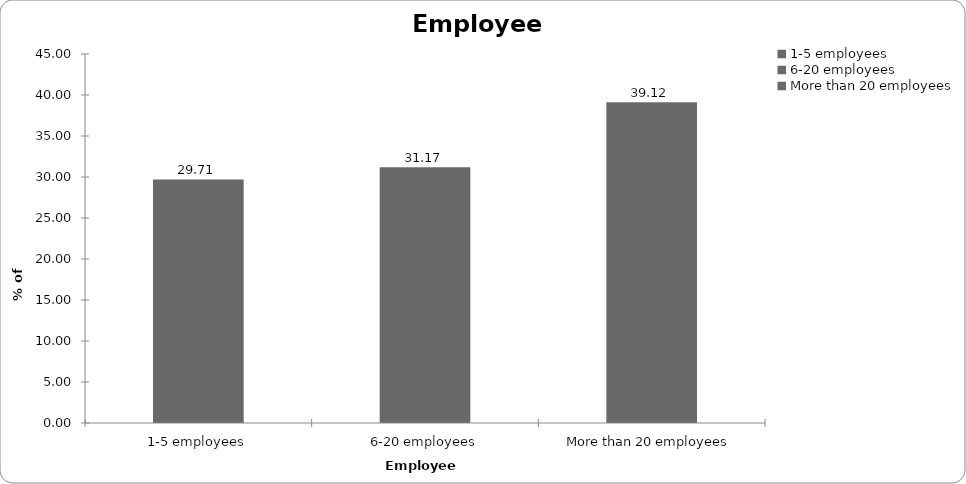
| Category | Employees |
|---|---|
| 1-5 employees | 29.706 |
| 6-20 employees | 31.175 |
| More than 20 employees | 39.119 |